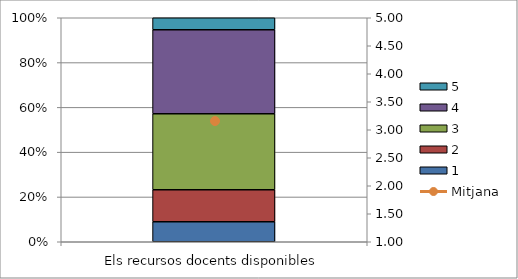
| Category | 1 | 2 | 3 | 4 | 5 |
|---|---|---|---|---|---|
| Els recursos docents disponibles | 5 | 8 | 19 | 21 | 3 |